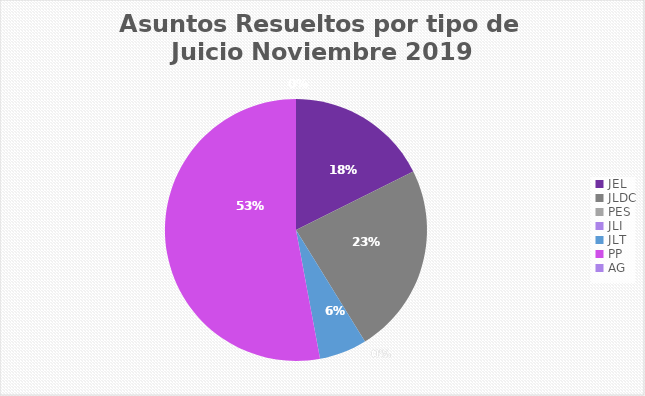
| Category | Asuntos Resueltos por tipo de Juicio  NOVIEMBRE |
|---|---|
| JEL | 3 |
| JLDC | 4 |
| PES | 0 |
| JLI | 0 |
| JLT | 1 |
| PP | 9 |
| AG | 0 |